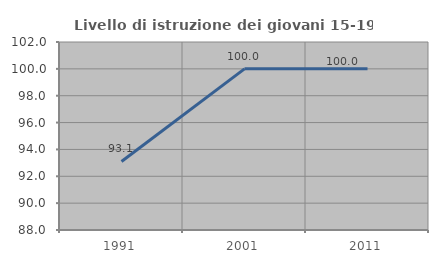
| Category | Livello di istruzione dei giovani 15-19 anni |
|---|---|
| 1991.0 | 93.103 |
| 2001.0 | 100 |
| 2011.0 | 100 |